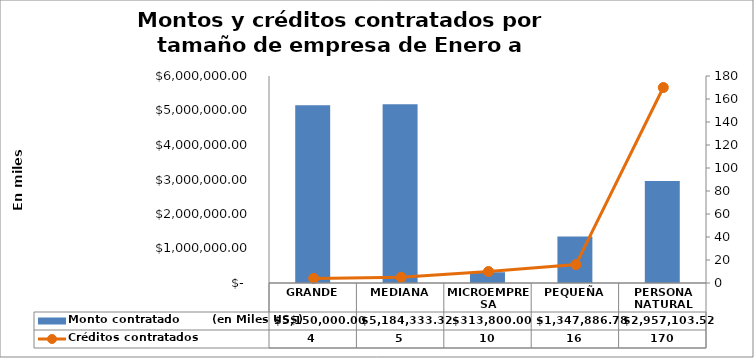
| Category | Monto contratado        (en Miles US$) |
|---|---|
| GRANDE | 5150000 |
| MEDIANA | 5184333.32 |
| MICROEMPRESA | 313800 |
| PEQUEÑA | 1347886.78 |
| PERSONA NATURAL | 2957103.52 |